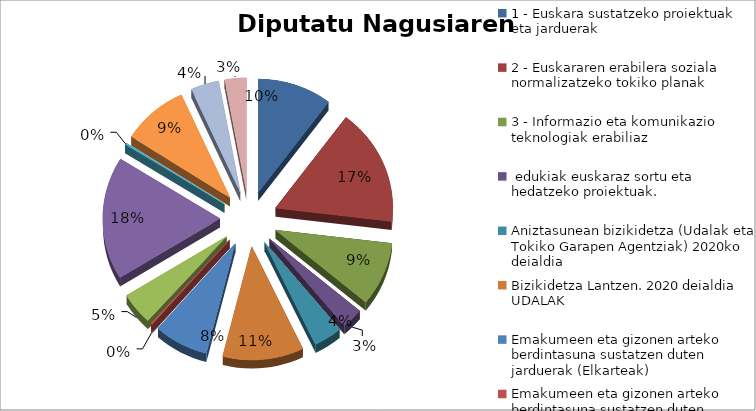
| Category |  Eskaerak | Ezetsiak | Emakida |
|---|---|---|---|
| 1 - Euskara sustatzeko proiektuak eta jarduerak | 45 | 6 | 415273 |
| 2 - Euskararen erabilera soziala normalizatzeko tokiko planak | 73 | 2 | 324324 |
| 3 - Informazio eta komunikazio teknologiak erabiliaz, edukiak euskaraz sortu eta hedatzeko proiektuak. | 40 | 4 | 212250 |
| Aniztasunean bizikidetza (Udalak eta Tokiko Garapen Agentziak) 2020ko deialdia | 13 | 1 | 105000 |
| Bizikidetza Lantzen. 2020 deialdia UDALAK | 17 | 0 | 140000 |
| Emakumeen eta gizonen arteko berdintasuna sustatzen duten jarduerak (Elkarteak) | 49 | 12 | 400547 |
| Emakumeen eta gizonen arteko berdintasuna sustatzen duten jarduerak (Udalak) | 33 | 1 | 371734.99 |
| Emakumeen eta gizonen berdintasunerako masterraren Hitzarmena (EHU) | 1 | 1 | 0 |
| Etorkizuna Eraikiz Gipuzkoa Taldean - I.2 Eranskina | 20 | 10 | 120120 |
| Etorkizuna Eraikiz. Gipuzkoa Taldean - I. 1 eranskina | 77 | 60 | 1073800 |
| Gipuzkoako enpresetako emakumeen eta gizonen berdintasuneko esperientzien sariak | 1 | 1 | 0 |
| Giza eskubideak eta aniztasunean bizikidetza (Elkarteak) 2020ko deialdia | 40 | 15 | 90000 |
| Oroimen historikoa. 2020ko deialdia. ELKARTEAK | 17 | 4 | 60000 |
| Oroimen Historikoa. 2020ko deialdia. UDALAK | 13 | 2 | 60000 |